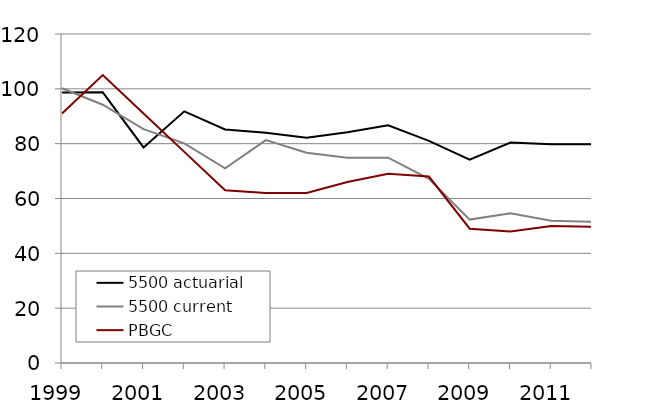
| Category | 5500 actuarial | 5500 current | PBGC |
|---|---|---|---|
| 1999.0 | 98.668 | 100.2 | 91 |
| 2000.0 | 98.737 | 94.2 | 105 |
| 2001.0 | 78.615 | 85.3 | 91 |
| 2002.0 | 91.799 | 80.1 | 77 |
| 2003.0 | 85.181 | 71 | 63 |
| 2004.0 | 84.013 | 81.3 | 62 |
| 2005.0 | 82.158 | 76.7 | 62 |
| 2006.0 | 84.161 | 74.9 | 66 |
| 2007.0 | 86.704 | 74.9 | 69 |
| 2008.0 | 81 | 67.2 | 68 |
| 2009.0 | 74.163 | 52.3 | 49 |
| 2010.0 | 80.396 | 54.6 | 48 |
| 2011.0 | 79.743 | 51.9 | 50 |
| 2012.0 | 79.743 | 51.5 | 49.7 |